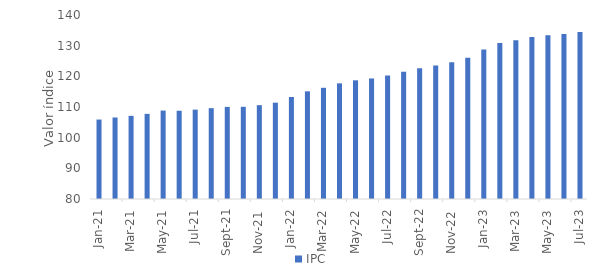
| Category | IPC |
|---|---|
| 2021-01-01 | 105.91 |
| 2021-02-01 | 106.58 |
| 2021-03-01 | 107.12 |
| 2021-04-01 | 107.76 |
| 2021-05-01 | 108.84 |
| 2021-06-01 | 108.78 |
| 2021-07-01 | 109.14 |
| 2021-08-01 | 109.62 |
| 2021-09-01 | 110.04 |
| 2021-10-01 | 110.06 |
| 2021-11-01 | 110.6 |
| 2021-12-01 | 111.41 |
| 2022-01-01 | 113.26 |
| 2022-02-01 | 115.11 |
| 2022-03-01 | 116.26 |
| 2022-04-01 | 117.71 |
| 2022-05-01 | 118.7 |
| 2022-06-01 | 119.31 |
| 2022-07-01 | 120.27 |
| 2022-08-01 | 121.5 |
| 2022-09-01 | 122.63 |
| 2022-10-01 | 123.51 |
| 2022-11-01 | 124.59 |
| 2022-12-01 | 126.03 |
| 2023-01-01 | 128.76 |
| 2023-02-01 | 130.87 |
| 2023-03-01 | 131.77 |
| 2023-04-01 | 132.8 |
| 2023-05-01 | 133.38 |
| 2023-06-01 | 133.78 |
| 2023-07-01 | 134.45 |